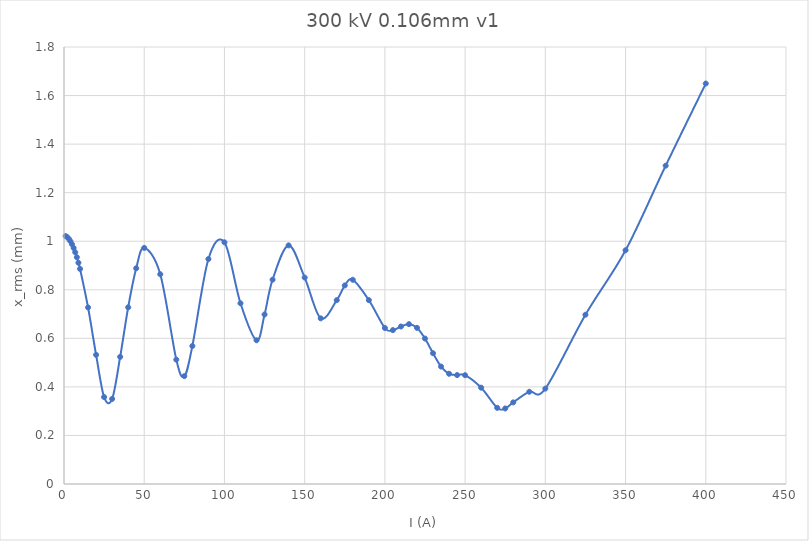
| Category | Series 0 |
|---|---|
| 1.0 | 1.021 |
| 2.0 | 1.017 |
| 3.0 | 1.01 |
| 4.0 | 1 |
| 5.0 | 0.988 |
| 6.0 | 0.972 |
| 7.0 | 0.954 |
| 8.0 | 0.934 |
| 9.0 | 0.911 |
| 10.0 | 0.886 |
| 15.0 | 0.727 |
| 20.0 | 0.532 |
| 25.0 | 0.358 |
| 30.0 | 0.35 |
| 35.0 | 0.524 |
| 40.0 | 0.728 |
| 45.0 | 0.889 |
| 50.0 | 0.972 |
| 60.0 | 0.864 |
| 70.0 | 0.512 |
| 75.0 | 0.444 |
| 80.0 | 0.568 |
| 90.0 | 0.927 |
| 100.0 | 0.996 |
| 110.0 | 0.744 |
| 120.0 | 0.592 |
| 125.0 | 0.698 |
| 130.0 | 0.842 |
| 140.0 | 0.983 |
| 150.0 | 0.85 |
| 160.0 | 0.682 |
| 170.0 | 0.757 |
| 175.0 | 0.818 |
| 180.0 | 0.841 |
| 190.0 | 0.757 |
| 200.0 | 0.642 |
| 205.0 | 0.634 |
| 210.0 | 0.649 |
| 215.0 | 0.658 |
| 220.0 | 0.643 |
| 225.0 | 0.599 |
| 230.0 | 0.539 |
| 235.0 | 0.484 |
| 240.0 | 0.454 |
| 245.0 | 0.449 |
| 250.0 | 0.448 |
| 260.0 | 0.397 |
| 270.0 | 0.314 |
| 275.0 | 0.311 |
| 280.0 | 0.336 |
| 290.0 | 0.38 |
| 300.0 | 0.393 |
| 325.0 | 0.697 |
| 350.0 | 0.963 |
| 375.0 | 1.311 |
| 400.0 | 1.65 |